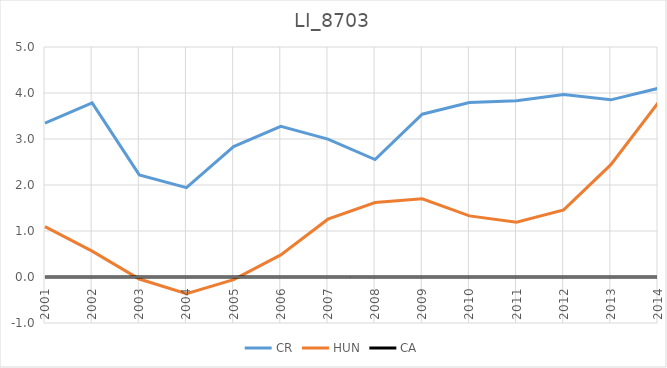
| Category | CR | HUN | CA |
|---|---|---|---|
| 2001.0 | 3.345 | 1.095 | 0 |
| 2002.0 | 3.783 | 0.562 | 0 |
| 2003.0 | 2.221 | -0.045 | 0 |
| 2004.0 | 1.942 | -0.364 | 0 |
| 2005.0 | 2.837 | -0.059 | 0 |
| 2006.0 | 3.275 | 0.48 | 0 |
| 2007.0 | 2.998 | 1.257 | 0 |
| 2008.0 | 2.553 | 1.617 | 0 |
| 2009.0 | 3.539 | 1.7 | 0 |
| 2010.0 | 3.793 | 1.329 | 0 |
| 2011.0 | 3.831 | 1.192 | 0 |
| 2012.0 | 3.965 | 1.459 | 0 |
| 2013.0 | 3.851 | 2.442 | 0 |
| 2014.0 | 4.101 | 3.786 | 0 |